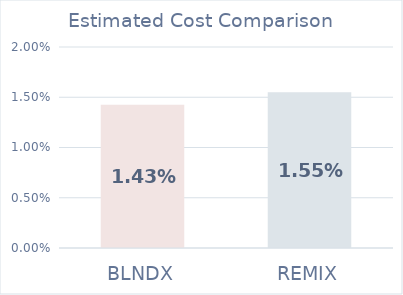
| Category | Series 0 |
|---|---|
| BLNDX | 0.014 |
| REMIX | 0.016 |